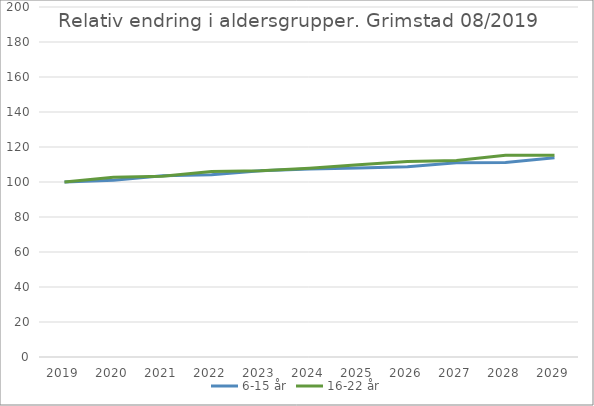
| Category | 6-15 år | 16-22 år |
|---|---|---|
| 2019 | 100 | 100 |
| 2020 | 100.955 | 102.7 |
| 2021 | 103.539 | 103.321 |
| 2022 | 104.212 | 105.947 |
| 2023 | 106.448 | 106.433 |
| 2024 | 107.472 | 107.895 |
| 2025 | 108.056 | 109.889 |
| 2026 | 108.777 | 111.666 |
| 2027 | 110.97 | 112.282 |
| 2028 | 111.157 | 115.215 |
| 2029 | 113.813 | 115.316 |